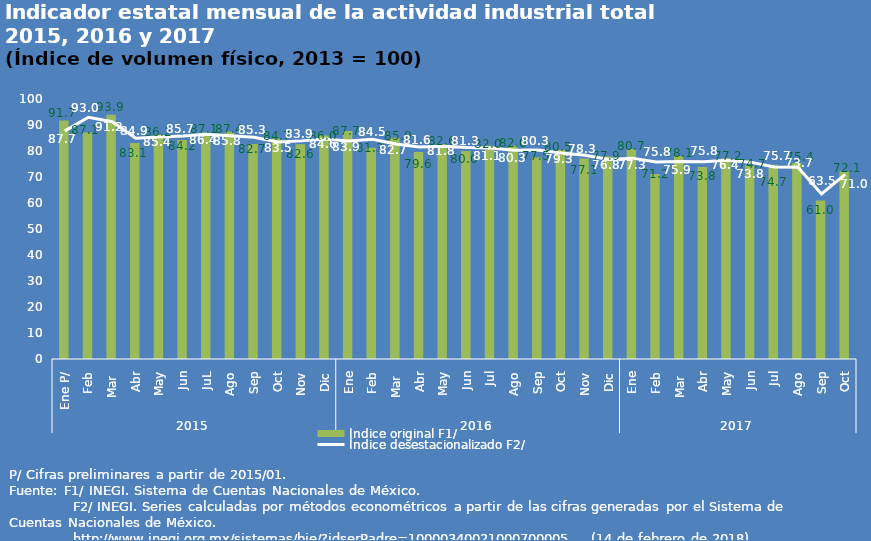
| Category | Índice original F1/ |
|---|---|
| 0 | 91.7 |
| 1 | 87.071 |
| 2 | 93.903 |
| 3 | 83.079 |
| 4 | 86.208 |
| 5 | 84.202 |
| 6 | 87.124 |
| 7 | 87.404 |
| 8 | 82.713 |
| 9 | 84.713 |
| 10 | 82.636 |
| 11 | 85.957 |
| 12 | 87.7 |
| 13 | 81.279 |
| 14 | 85.05 |
| 15 | 79.606 |
| 16 | 82.575 |
| 17 | 80.042 |
| 18 | 81.992 |
| 19 | 81.974 |
| 20 | 77.477 |
| 21 | 80.47 |
| 22 | 77.119 |
| 23 | 77.901 |
| 24 | 80.747 |
| 25 | 71.198 |
| 26 | 78.091 |
| 27 | 73.838 |
| 28 | 77.228 |
| 29 | 74.663 |
| 30 | 74.725 |
| 31 | 75.41 |
| 32 | 60.98 |
| 33 | 72.148 |